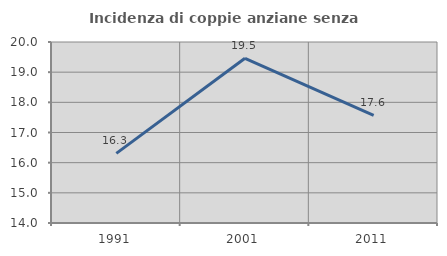
| Category | Incidenza di coppie anziane senza figli  |
|---|---|
| 1991.0 | 16.309 |
| 2001.0 | 19.461 |
| 2011.0 | 17.568 |